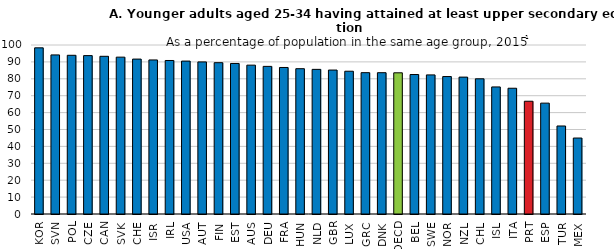
| Category | Age 25-34 |
|---|---|
| KOR | 98.326 |
| SVN | 94.135 |
| POL | 93.91 |
| CZE | 93.722 |
| CAN | 93.314 |
| SVK | 92.811 |
| CHE | 91.667 |
| ISR | 91.16 |
| IRL | 90.833 |
| USA | 90.482 |
| AUT | 89.993 |
| FIN | 89.535 |
| EST | 89.079 |
| AUS | 88.079 |
| DEU | 87.349 |
| FRA | 86.698 |
| HUN | 85.975 |
| NLD | 85.586 |
| GBR | 85.178 |
| LUX | 84.486 |
| GRC | 83.634 |
| DNK | 83.611 |
| OECD | 83.546 |
| BEL | 82.531 |
| SWE | 82.312 |
| NOR | 81.33 |
| NZL | 80.995 |
| CHL | 79.997 |
| ISL | 75.19 |
| ITA | 74.411 |
| PRT | 66.725 |
| ESP | 65.597 |
| TUR | 52.077 |
| MEX | 44.947 |